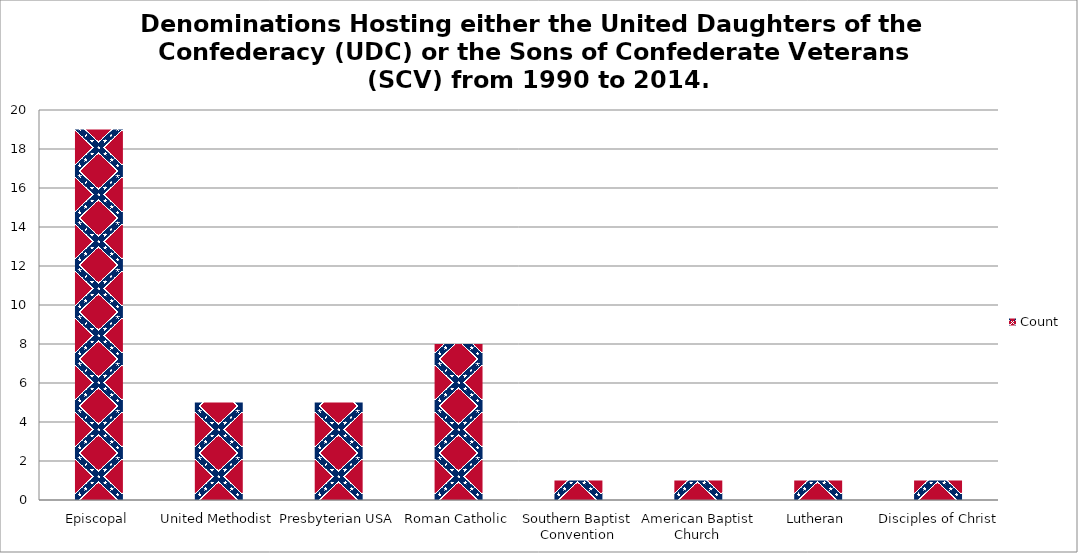
| Category | Count |
|---|---|
| Episcopal | 19 |
| United Methodist | 5 |
| Presbyterian USA | 5 |
| Roman Catholic | 8 |
| Southern Baptist Convention | 1 |
| American Baptist Church | 1 |
| Lutheran | 1 |
| Disciples of Christ | 1 |